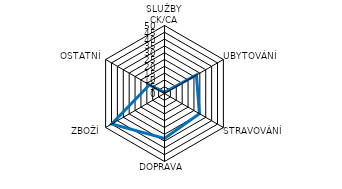
| Category | Series 0 |
|---|---|
| SLUŽBY CK/CA | 0.807 |
| UBYTOVÁNÍ | 27.139 |
| STRAVOVÁNÍ | 29.643 |
| DOPRAVA | 32.999 |
| ZBOŽÍ | 44.839 |
| OSTATNÍ | 12.797 |